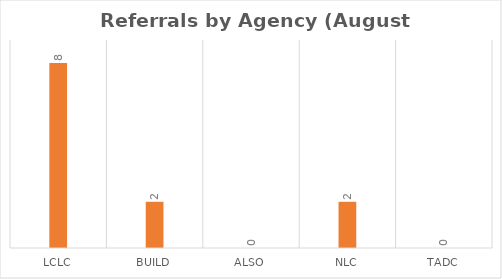
| Category | Series 0 |
|---|---|
| LCLC | 8 |
| BUILD | 2 |
| ALSO | 0 |
| NLC | 2 |
| TADC | 0 |